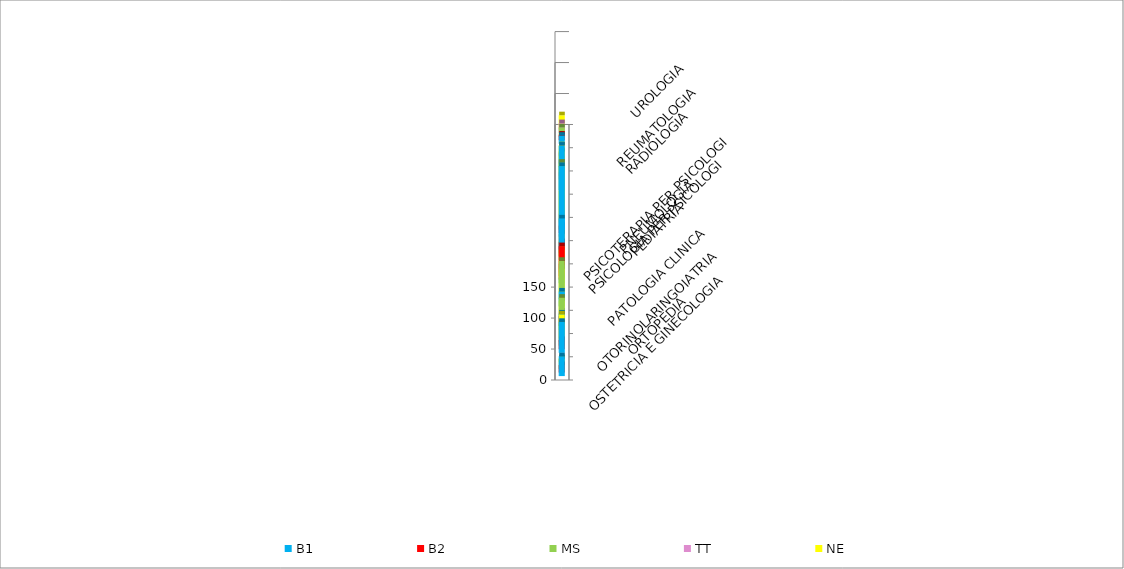
| Category | B1 | B2 | MS | TT | NE |
|---|---|---|---|---|---|
| ORTOPEDIA | 32 | 12 | 16 | 0 | 6 |
| OSTETRICIA E GINECOLOGIA | 50 | 15 | 36 | 21 | 39 |
| OTORINOLARINGOIATRIA | 26 | 16 | 40 | 12 | 24 |
| PATOLOGIA CLINICA | 24 | 0 | 62 | 0 | 38 |
| PEDIATRIA | 9 | 54 | 20 | 6 | 31 |
| PNEUMOLOGIA | 67 | 23 | 31 | 24 | 8 |
| PSICOLOGIA PER PSICOLOGI | 114 | 12 | 108 | 19 | 51 |
| PSICOTERAPIA PER PSICOLOGI | 0 | 0 | 0 | 0 | 0 |
| RADIOLOGIA | 72 | 0 | 0 | 12 | 40 |
| REUMATOLOGIA | 12 | 6 | 12 | 6 | 12 |
| UROLOGIA | 13 | 9 | 15 | 16 | 23 |